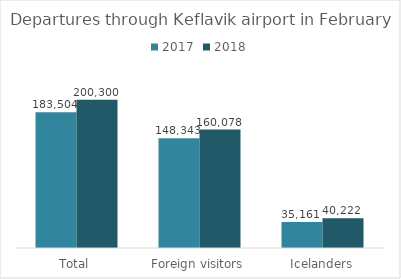
| Category | 2017 | 2018 |
|---|---|---|
| Total | 183504 | 200300 |
| Foreign visitors | 148343 | 160078 |
| Icelanders | 35161 | 40222 |